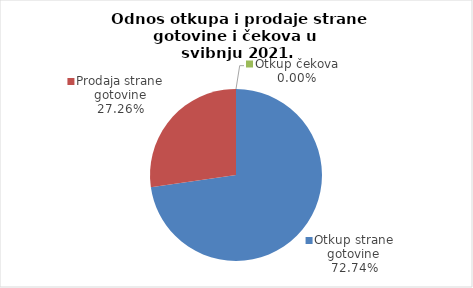
| Category | Series 0 |
|---|---|
| Otkup strane gotovine | 72.74 |
| Prodaja strane gotovine | 27.26 |
| Otkup čekova | 0 |